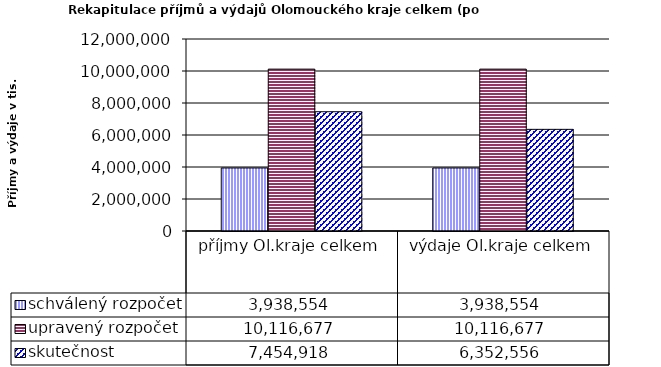
| Category | schválený rozpočet | upravený rozpočet | skutečnost |
|---|---|---|---|
| příjmy Ol.kraje celkem | 3938554 | 10116677 | 7454918 |
| výdaje Ol.kraje celkem | 3938554 | 10116677 | 6352556 |